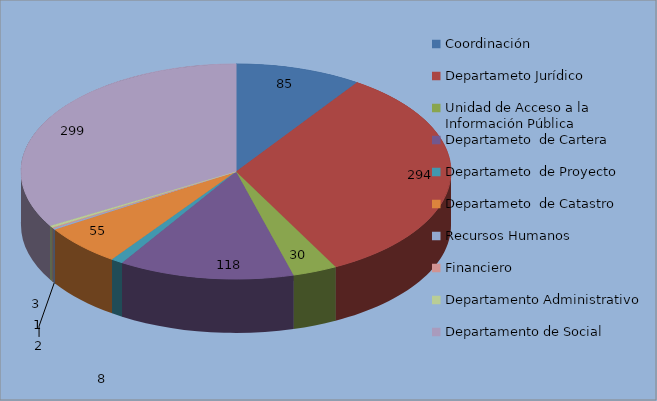
| Category | Series 0 |
|---|---|
| Coordinación | 85 |
| Departameto Jurídico  | 294 |
| Unidad de Acceso a la Información Pública | 30 |
| Departameto  de Cartera | 118 |
| Departameto  de Proyecto | 8 |
| Departameto  de Catastro | 55 |
| Recursos Humanos  | 2 |
| Financiero  | 1 |
| Departamento Administrativo | 3 |
| Departamento de Social | 299 |